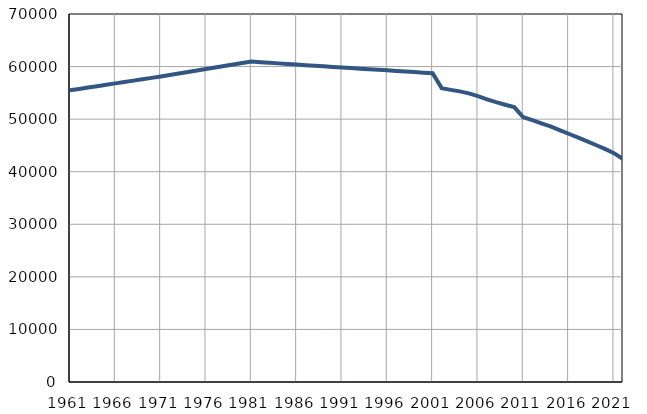
| Category | Број
становника |
|---|---|
| 1961.0 | 55488 |
| 1962.0 | 55750 |
| 1963.0 | 56013 |
| 1964.0 | 56275 |
| 1965.0 | 56538 |
| 1966.0 | 56800 |
| 1967.0 | 57062 |
| 1968.0 | 57325 |
| 1969.0 | 57587 |
| 1970.0 | 57850 |
| 1971.0 | 58112 |
| 1972.0 | 58395 |
| 1973.0 | 58679 |
| 1974.0 | 58962 |
| 1975.0 | 59245 |
| 1976.0 | 59529 |
| 1977.0 | 59812 |
| 1978.0 | 60095 |
| 1979.0 | 60378 |
| 1980.0 | 60662 |
| 1981.0 | 60945 |
| 1982.0 | 60833 |
| 1983.0 | 60720 |
| 1984.0 | 60608 |
| 1985.0 | 60496 |
| 1986.0 | 60383 |
| 1987.0 | 60270 |
| 1988.0 | 60158 |
| 1989.0 | 60046 |
| 1990.0 | 59934 |
| 1991.0 | 59822 |
| 1992.0 | 59714 |
| 1993.0 | 59604 |
| 1994.0 | 59497 |
| 1995.0 | 59388 |
| 1996.0 | 59280 |
| 1997.0 | 59171 |
| 1998.0 | 59062 |
| 1999.0 | 58954 |
| 2000.0 | 58846 |
| 2001.0 | 58737 |
| 2002.0 | 55897 |
| 2003.0 | 55572 |
| 2004.0 | 55282 |
| 2005.0 | 54894 |
| 2006.0 | 54367 |
| 2007.0 | 53778 |
| 2008.0 | 53225 |
| 2009.0 | 52746 |
| 2010.0 | 52285 |
| 2011.0 | 50359 |
| 2012.0 | 49801 |
| 2013.0 | 49185 |
| 2014.0 | 48611 |
| 2015.0 | 47929 |
| 2016.0 | 47221 |
| 2017.0 | 46543 |
| 2018.0 | 45823 |
| 2019.0 | 45080 |
| 2020.0 | 44341 |
| 2021.0 | 43535 |
| 2022.0 | 42400 |